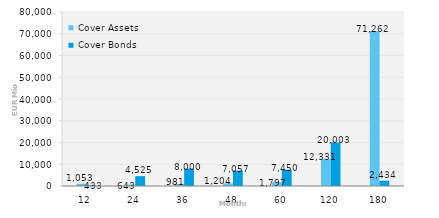
| Category | Cover Assets | Cover Bonds |
|---|---|---|
| 12.0 | 1052.709 | 432.617 |
| 24.0 | 643.46 | 4525 |
| 36.0 | 981.148 | 8000 |
| 48.0 | 1204.235 | 7057.222 |
| 60.0 | 1797.077 | 7450 |
| 120.0 | 12330.598 | 20003.161 |
| 180.0 | 71261.915 | 2434.077 |